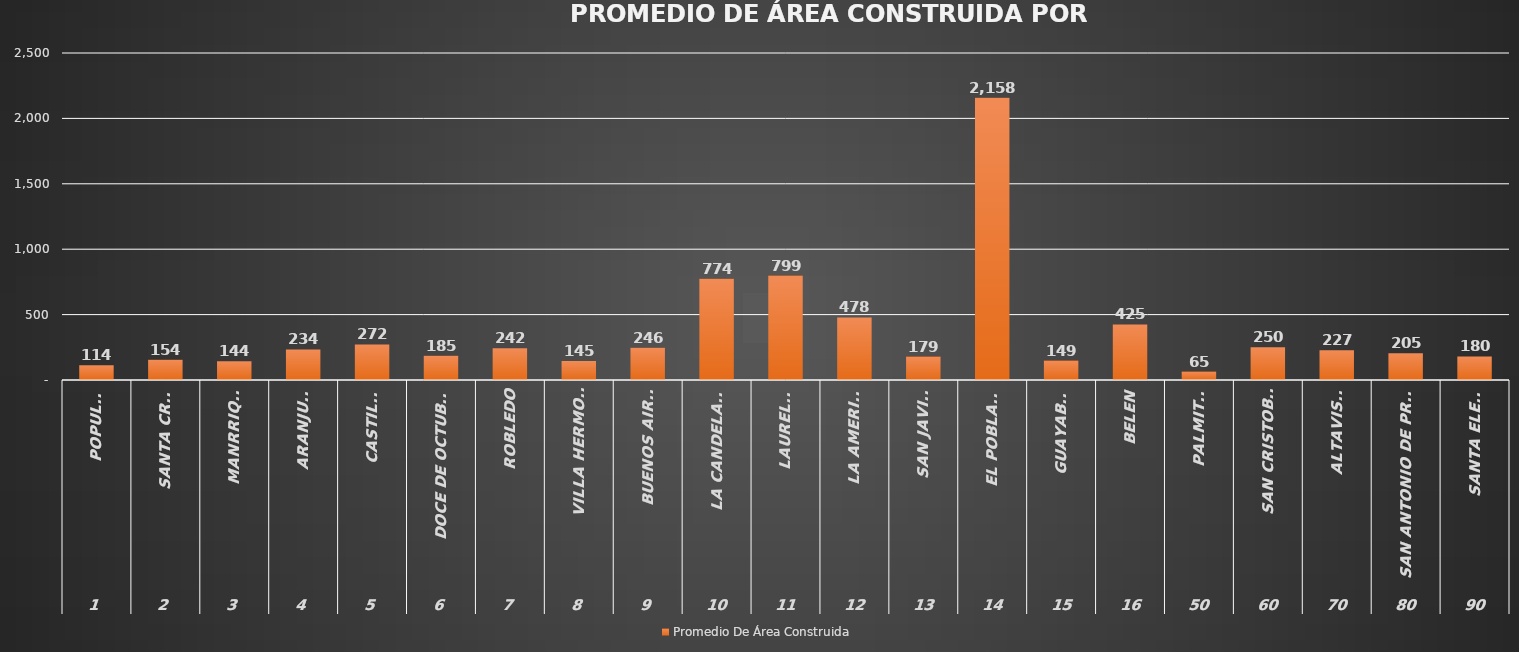
| Category | Promedio De Área Construida |
|---|---|
| 0 | 113.653 |
| 1 | 154.349 |
| 2 | 143.739 |
| 3 | 233.804 |
| 4 | 271.626 |
| 5 | 185.373 |
| 6 | 242.181 |
| 7 | 144.675 |
| 8 | 246.368 |
| 9 | 774.436 |
| 10 | 798.567 |
| 11 | 478.482 |
| 12 | 178.748 |
| 13 | 2157.907 |
| 14 | 148.563 |
| 15 | 424.868 |
| 16 | 64.659 |
| 17 | 250.399 |
| 18 | 227.315 |
| 19 | 204.539 |
| 20 | 180.186 |